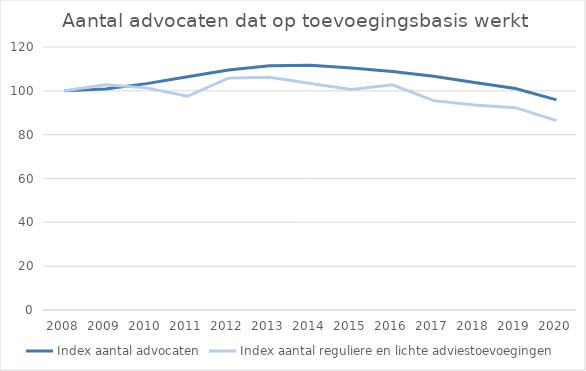
| Category | Index aantal advocaten | Index aantal reguliere en lichte adviestoevoegingen |
|---|---|---|
| 2008.0 | 100 | 100 |
| 2009.0 | 100.852 | 102.811 |
| 2010.0 | 103.289 | 101.351 |
| 2011.0 | 106.417 | 97.52 |
| 2012.0 | 109.53 | 105.8 |
| 2013.0 | 111.468 | 106.17 |
| 2014.0 | 111.645 | 103.361 |
| 2015.0 | 110.426 | 100.612 |
| 2016.0 | 108.811 | 102.755 |
| 2017.0 | 106.608 | 95.52 |
| 2018.0 | 103.847 | 93.511 |
| 2019.0 | 101.072 | 92.337 |
| 2020.0 | 95.874 | 86.375 |